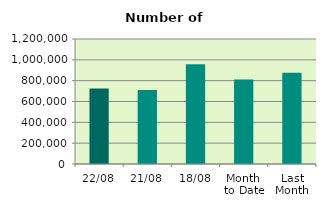
| Category | Series 0 |
|---|---|
| 22/08 | 724682 |
| 21/08 | 709672 |
| 18/08 | 957270 |
| Month 
to Date | 811798 |
| Last
Month | 877151.619 |